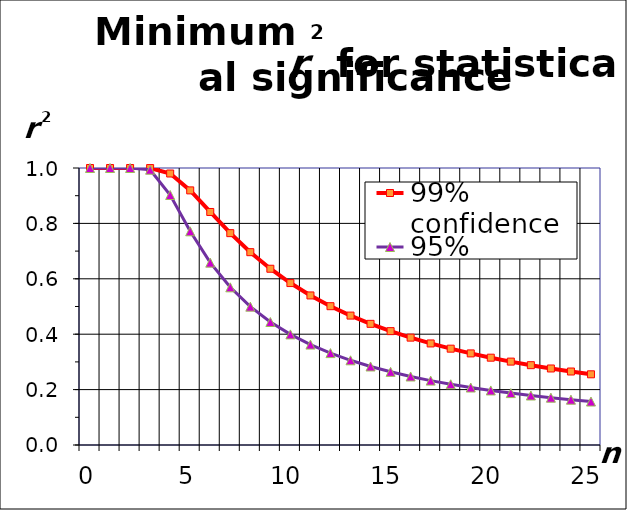
| Category | 99% confidence | 95% confidence |
|---|---|---|
| 0.0 | 1 | 1 |
| 1.0 | 1 | 1 |
| 2.0 | 1 | 1 |
| 3.0 | 1 | 0.994 |
| 4.0 | 0.98 | 0.902 |
| 5.0 | 0.919 | 0.771 |
| 6.0 | 0.841 | 0.658 |
| 7.0 | 0.765 | 0.569 |
| 8.0 | 0.696 | 0.499 |
| 9.0 | 0.636 | 0.444 |
| 10.0 | 0.585 | 0.399 |
| 11.0 | 0.54 | 0.362 |
| 12.0 | 0.501 | 0.332 |
| 13.0 | 0.467 | 0.306 |
| 14.0 | 0.437 | 0.283 |
| 15.0 | 0.411 | 0.264 |
| 16.0 | 0.388 | 0.247 |
| 17.0 | 0.367 | 0.232 |
| 18.0 | 0.348 | 0.219 |
| 19.0 | 0.331 | 0.208 |
| 20.0 | 0.315 | 0.197 |
| 21.0 | 0.301 | 0.187 |
| 22.0 | 0.288 | 0.179 |
| 23.0 | 0.276 | 0.171 |
| 24.0 | 0.265 | 0.164 |
| 25.0 | 0.255 | 0.157 |